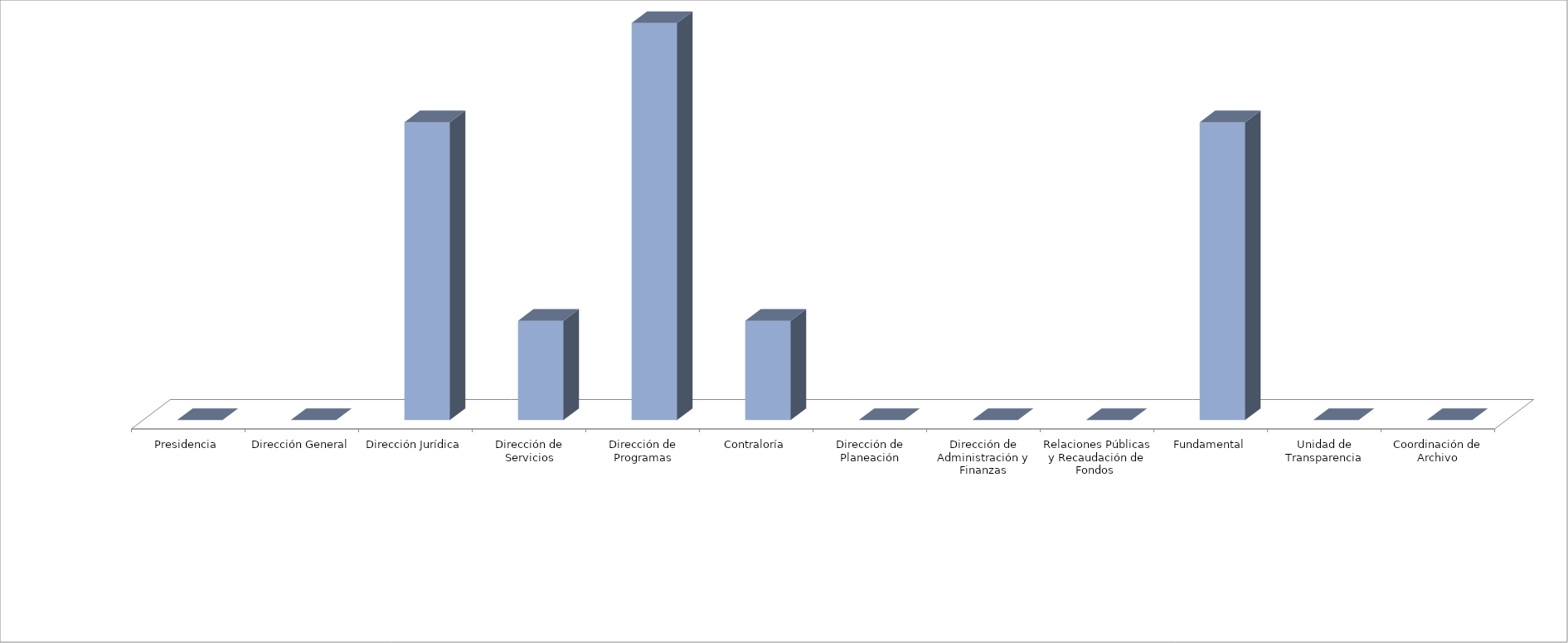
| Category | Series 0 | Series 1 |
|---|---|---|
| Presidencia |  | 0 |
| Dirección General |  | 0 |
| Dirección Jurídica |  | 3 |
| Dirección de Servicios |  | 1 |
| Dirección de Programas |  | 4 |
| Contraloría |  | 1 |
| Dirección de Planeación |  | 0 |
| Dirección de Administración y Finanzas |  | 0 |
| Relaciones Públicas y Recaudación de Fondos  |  | 0 |
| Fundamental |  | 3 |
| Unidad de Transparencia |  | 0 |
| Coordinación de Archivo |  | 0 |